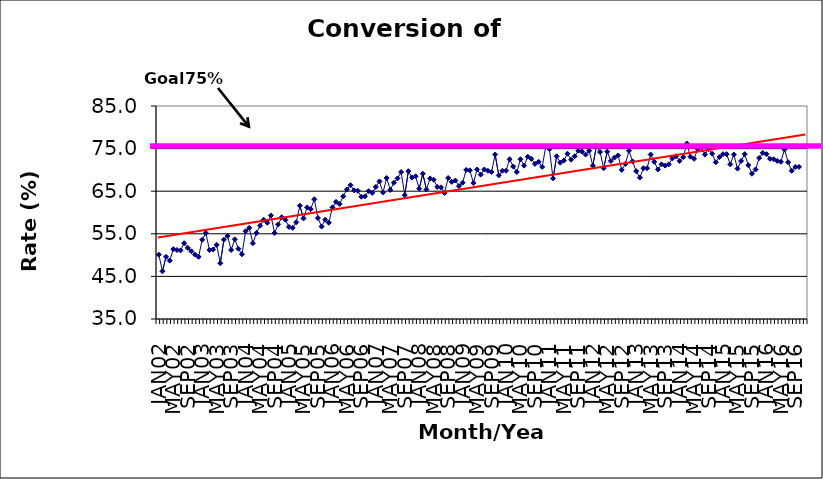
| Category | Series 0 |
|---|---|
| JAN02 | 50.1 |
| FEB02 | 46.2 |
| MAR02 | 49.6 |
| APR02 | 48.7 |
| MAY02 | 51.4 |
| JUN02 | 51.2 |
| JUL02 | 51.1 |
| AUG02 | 52.8 |
| SEP02 | 51.7 |
| OCT02 | 50.9 |
| NOV02 | 50.1 |
| DEC02 | 49.6 |
| JAN03 | 53.6 |
| FEB03 | 55.2 |
| MAR03 | 51.2 |
| APR03 | 51.3 |
| MAY03 | 52.4 |
| JUN03 | 48.1 |
| JUL03 | 53.6 |
| AUG03 | 54.5 |
| SEP03 | 51.2 |
| OCT03 | 53.7 |
| NOV03 | 51.5 |
| DEC03 | 50.2 |
| JAN04 | 55.6 |
| FEB04 | 56.4 |
| MAR04 | 52.8 |
| APR04 | 55.2 |
| MAY04 | 56.9 |
| JUN04 | 58.3 |
| JUL04 | 57.6 |
| AUG04 | 59.3 |
| SEP04 | 55.2 |
| OCT04 | 57.2 |
| NOV04 | 58.9 |
| DEC04 | 58.3 |
| JAN05 | 56.6 |
| FEB05 | 56.4 |
| MAR05 | 57.7 |
| APR05 | 61.6 |
| MAY05 | 58.6 |
| JUN05 | 61.2 |
| JUL05 | 60.8 |
| AUG05 | 63.1 |
| SEP05 | 58.7 |
| OCT05 | 56.7 |
| NOV05 | 58.3 |
| DEC05 | 57.6 |
| JAN06 | 61.2 |
| FEB06 | 62.5 |
| MAR06 | 62 |
| APR06 | 63.8 |
| MAY06 | 65.4 |
| JUN06 | 66.4 |
| JUL06 | 65.2 |
| AUG06 | 65.1 |
| SEP06 | 63.7 |
| OCT06 | 63.8 |
| NOV06 | 65 |
| DEC06 | 64.6 |
| JAN07 | 66 |
| FEB07 | 67.3 |
| MAR07 | 64.7 |
| APR07 | 68.1 |
| MAY07 | 65.3 |
| JUN07 | 67 |
| JUL07 | 68 |
| AUG07 | 69.5 |
| SEP07 | 64.1 |
| OCT07 | 69.7 |
| NOV07 | 68.2 |
| DEC07 | 68.5 |
| JAN08 | 65.6 |
| FEB08 | 69.1 |
| MAR08 | 65.4 |
| APR08 | 68 |
| MAY08 | 67.7 |
| JUN08 | 66 |
| JUL08 | 65.9 |
| AUG08 | 64.6 |
| SEP08 | 68.1 |
| OCT08 | 67.2 |
| NOV08 | 67.5 |
| DEC08 | 66.2 |
| JAN09 | 67 |
| FEB09 | 70 |
| MAR09 | 69.9 |
| APR09 | 66.9 |
| MAY09 | 70.1 |
| JUN09 | 68.9 |
| JUL09 | 70.1 |
| AUG09 | 69.8 |
| SEP09 | 69.5 |
| OCT09 | 73.6 |
| NOV09 | 68.7 |
| DEC09 | 69.8 |
| JAN10 | 69.8 |
| FEB10 | 72.5 |
| MAR10 | 70.8 |
| APR10 | 69.5 |
| MAY10 | 72.5 |
| JUN10 | 71 |
| JUL10 | 73.1 |
| AUG10 | 72.6 |
| SEP10 | 71.4 |
| OCT10 | 71.9 |
| NOV10 | 70.7 |
| DEC10 | 75.5 |
| JAN11 | 74.9 |
| FEB11 | 68 |
| MAR11 | 73.2 |
| APR11 | 71.7 |
| MAY11 | 72.2 |
| JUN11 | 73.8 |
| JUL11 | 72.4 |
| AUG11 | 73.2 |
| SEP11 | 74.5 |
| OCT11 | 74.3 |
| NOV11 | 73.6 |
| DEC11 | 74.5 |
| JAN12 | 71 |
| FEB12 | 75.6 |
| MAR12 | 74.2 |
| APR12 | 70.4 |
| MAY12 | 74.3 |
| JUN12 | 72.1 |
| JUL12 | 72.9 |
| AUG12 | 73.4 |
| SEP12 | 70 |
| OCT12 | 71.4 |
| NOV12 | 74.5 |
| DEC12 | 72 |
| JAN13 | 69.7 |
| FEB13 | 68.2 |
| MAR13 | 70.4 |
| APR13 | 70.4 |
| MAY13 | 73.6 |
| JUN13 | 71.9 |
| JUL13 | 70.1 |
| AUG13 | 71.3 |
| SEP13 | 71 |
| OCT13 | 71.3 |
| NOV13 | 72.7 |
| DEC13 | 73.2 |
| JAN14 | 72.1 |
| FEB14 | 73 |
| MAR14 | 76.2 |
| APR14 | 73.1 |
| MAY14 | 72.6 |
| JUN14 | 74.9 |
| JUL14 | 75.4 |
| AUG14 | 73.6 |
| SEP14 | 74.9 |
| OCT14 | 73.8 |
| NOV14 | 71.8 |
| DEC14 | 73 |
| JAN15 | 73.7 |
| FEB15 | 73.7 |
| MAR15 | 71.3 |
| APR15 | 73.6 |
| MAY15 | 70.3 |
| JUN15 | 72.1 |
| JUL15 | 73.7 |
| AUG15 | 71.1 |
| SEP15 | 69.1 |
| OCT15 | 70.1 |
| NOV15 | 72.8 |
| DEC15 | 74 |
| JAN16 | 73.7 |
| FEB16 | 72.6 |
| MAR16 | 72.5 |
| APR16 | 72.1 |
| MAY16 | 71.9 |
| JUN16 | 74.8 |
| JUL16 | 71.8 |
| AUG16 | 69.8 |
| SEP16 | 70.7 |
| OCT16 | 70.7 |